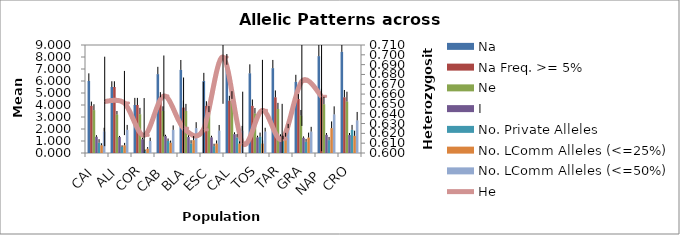
| Category | Na | Na Freq. >= 5% | Ne | I | No. Private Alleles | No. LComm Alleles (<=25%) | No. LComm Alleles (<=50%) |
|---|---|---|---|---|---|---|---|
| CAI | 6 | 3.929 | 3.572 | 1.354 | 0.857 | 0.643 | 1.786 |
| ALI | 5.5 | 5.5 | 3.205 | 1.329 | 0.5 | 0.643 | 1.929 |
| COR | 4 | 4 | 3.231 | 1.143 | 0.143 | 0.357 | 1 |
| CAB | 6.571 | 4.643 | 3.502 | 1.404 | 1 | 0.857 | 1.929 |
| BLA | 6.929 | 3.786 | 3.51 | 1.329 | 0.786 | 1.071 | 2.071 |
| ESC  | 6 | 3.929 | 3.401 | 1.305 | 0.571 | 0.786 | 1.857 |
| CAL | 7.357 | 4.357 | 4.511 | 1.569 | 1.286 | 0.786 | 1.857 |
| TOS | 6.643 | 3.929 | 3.287 | 1.3 | 1.357 | 0.786 | 1.786 |
| TAR | 7.071 | 4.643 | 3.666 | 1.418 | 1.143 | 1.357 | 2.071 |
| GRA | 5.929 | 4.5 | 3.11 | 1.27 | 0.929 | 1.286 | 1.786 |
| NAP  | 8.071 | 4.857 | 4.065 | 1.517 | 1.071 | 2.071 | 3.214 |
| CRO | 8.429 | 4.643 | 4.29 | 1.495 | 1.929 | 1.429 | 2.714 |